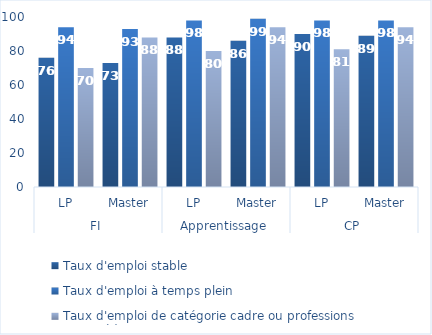
| Category | Taux d'emploi stable | Taux d'emploi à temps plein | Taux d'emploi de catégorie cadre ou professions intermédiaires |
|---|---|---|---|
| 0 | 76 | 94 | 70 |
| 1 | 73 | 93 | 88 |
| 2 | 88 | 98 | 80 |
| 3 | 86 | 99 | 94 |
| 4 | 90 | 98 | 81 |
| 5 | 89 | 98 | 94 |